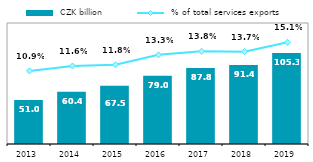
| Category |  CZK billion |
|---|---|
| 2013.0 | 51.021 |
| 2014.0 | 60.444 |
| 2015.0 | 67.463 |
| 2016.0 | 79.004 |
| 2017.0 | 87.808 |
| 2018.0 | 91.441 |
| 2019.0 | 105.286 |